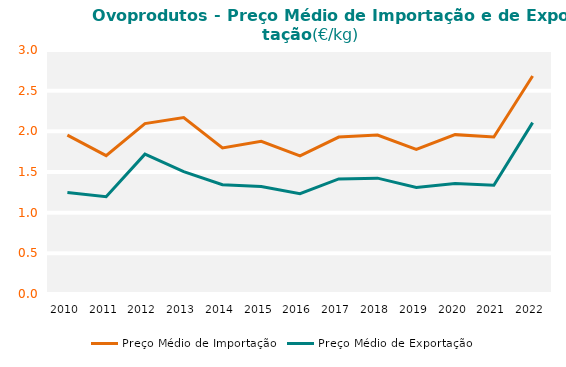
| Category | Preço Médio de Importação | Preço Médio de Exportação |
|---|---|---|
| 2010.0 | 1.953 | 1.249 |
| 2011.0 | 1.701 | 1.197 |
| 2012.0 | 2.095 | 1.72 |
| 2013.0 | 2.17 | 1.503 |
| 2014.0 | 1.795 | 1.343 |
| 2015.0 | 1.877 | 1.322 |
| 2016.0 | 1.698 | 1.234 |
| 2017.0 | 1.93 | 1.415 |
| 2018.0 | 1.954 | 1.425 |
| 2019.0 | 1.779 | 1.31 |
| 2020.0 | 1.959 | 1.359 |
| 2021.0 | 1.931 | 1.337 |
| 2022.0 | 2.68 | 2.107 |